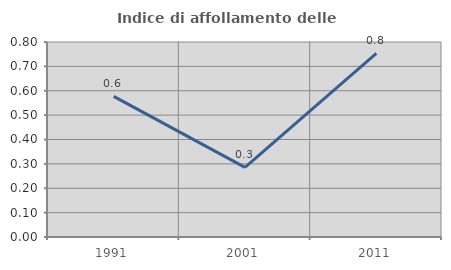
| Category | Indice di affollamento delle abitazioni  |
|---|---|
| 1991.0 | 0.577 |
| 2001.0 | 0.286 |
| 2011.0 | 0.753 |